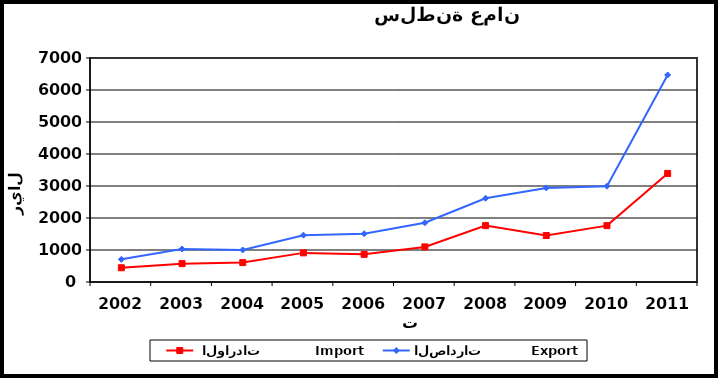
| Category |  الواردات           Import | الصادرات          Export |
|---|---|---|
| 2002.0 | 445 | 708 |
| 2003.0 | 574 | 1032 |
| 2004.0 | 606 | 1001 |
| 2005.0 | 910 | 1463 |
| 2006.0 | 865 | 1510 |
| 2007.0 | 1097 | 1851 |
| 2008.0 | 1762 | 2617 |
| 2009.0 | 1453 | 2940 |
| 2010.0 | 1762 | 2995 |
| 2011.0 | 3392 | 6471 |